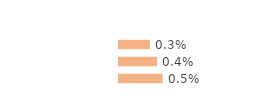
| Category | Series 0 |
|---|---|
| Immigrées | 0.003 |
| Descendantes d'immigré(s) | 0.004 |
| Ni immigrées, ni descendantes | 0.005 |